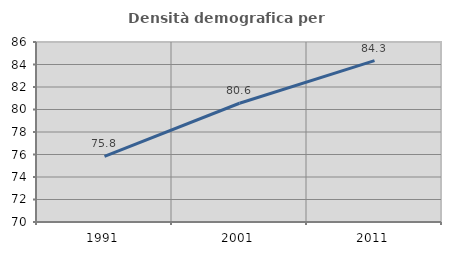
| Category | Densità demografica |
|---|---|
| 1991.0 | 75.841 |
| 2001.0 | 80.557 |
| 2011.0 | 84.339 |